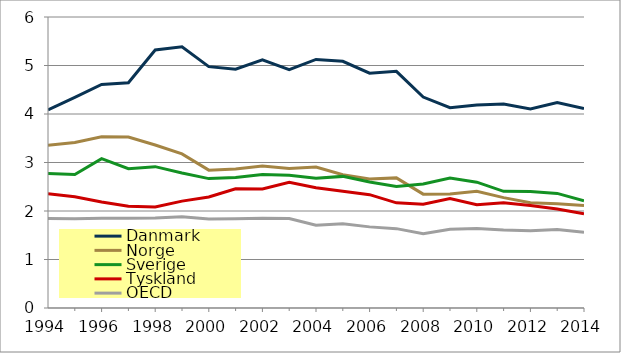
| Category | Danmark | Norge | Sverige | Tyskland | OECD |
|---|---|---|---|---|---|
| 1994-01-01 | 4.086 | 3.356 | 2.773 | 2.354 | 1.846 |
| 1995-01-01 | 4.345 | 3.411 | 2.753 | 2.292 | 1.843 |
| 1996-01-01 | 4.61 | 3.532 | 3.08 | 2.186 | 1.849 |
| 1997-01-01 | 4.643 | 3.524 | 2.873 | 2.1 | 1.849 |
| 1998-01-01 | 5.321 | 3.361 | 2.914 | 2.084 | 1.854 |
| 1999-01-01 | 5.386 | 3.178 | 2.784 | 2.204 | 1.883 |
| 2000-01-01 | 4.976 | 2.842 | 2.668 | 2.288 | 1.833 |
| 2001-01-01 | 4.924 | 2.865 | 2.69 | 2.46 | 1.84 |
| 2002-01-01 | 5.115 | 2.93 | 2.753 | 2.454 | 1.853 |
| 2003-01-01 | 4.916 | 2.876 | 2.736 | 2.594 | 1.844 |
| 2004-01-01 | 5.125 | 2.907 | 2.675 | 2.478 | 1.706 |
| 2005-01-01 | 5.087 | 2.746 | 2.714 | 2.407 | 1.738 |
| 2006-01-01 | 4.842 | 2.662 | 2.596 | 2.337 | 1.673 |
| 2007-01-01 | 4.879 | 2.683 | 2.507 | 2.168 | 1.636 |
| 2008-01-01 | 4.35 | 2.348 | 2.556 | 2.139 | 1.531 |
| 2009-01-01 | 4.129 | 2.352 | 2.682 | 2.256 | 1.625 |
| 2010-01-01 | 4.184 | 2.409 | 2.594 | 2.129 | 1.639 |
| 2011-01-01 | 4.206 | 2.275 | 2.406 | 2.17 | 1.609 |
| 2012-01-01 | 4.104 | 2.17 | 2.403 | 2.115 | 1.593 |
| 2013-01-01 | 4.237 | 2.148 | 2.362 | 2.042 | 1.619 |
| 2014-01-01 | 4.112 | 2.116 | 2.21 | 1.945 | 1.562 |